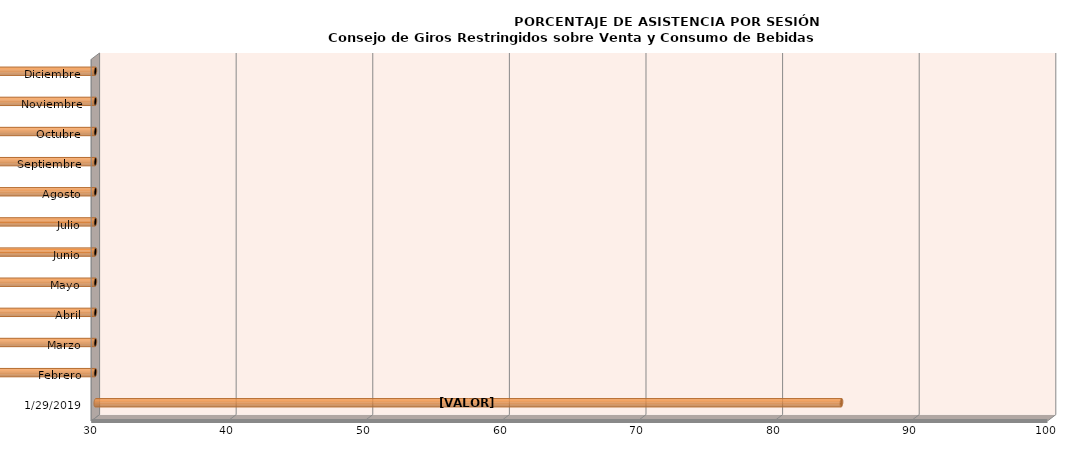
| Category | Series 0 |
|---|---|
| 29/01/2019 | 84.615 |
| Febrero | 0 |
| Marzo | 0 |
| Abril | 0 |
| Mayo | 0 |
| Junio | 0 |
| Julio | 0 |
| Agosto | 0 |
| Septiembre | 0 |
| Octubre | 0 |
| Noviembre | 0 |
| Diciembre | 0 |